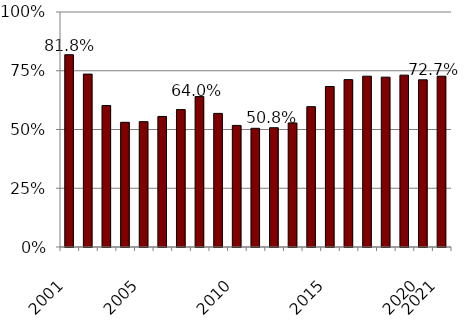
| Category | Series 0 |
|---|---|
| 2001.0 | 0.818 |
| nan | 0.736 |
| nan | 0.602 |
| nan | 0.531 |
| 2005.0 | 0.533 |
| nan | 0.556 |
| nan | 0.585 |
| nan | 0.64 |
| nan | 0.569 |
| 2010.0 | 0.517 |
| nan | 0.505 |
| nan | 0.508 |
| nan | 0.528 |
| nan | 0.597 |
| 2015.0 | 0.683 |
| nan | 0.712 |
| nan | 0.727 |
| nan | 0.723 |
| nan | 0.731 |
| 2020.0 | 0.711 |
| 2021.0 | 0.727 |